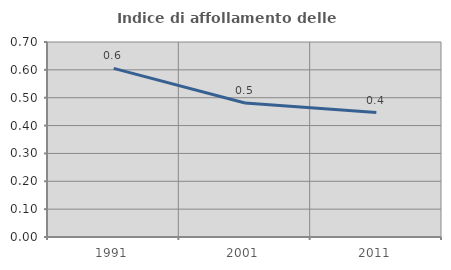
| Category | Indice di affollamento delle abitazioni  |
|---|---|
| 1991.0 | 0.605 |
| 2001.0 | 0.481 |
| 2011.0 | 0.447 |